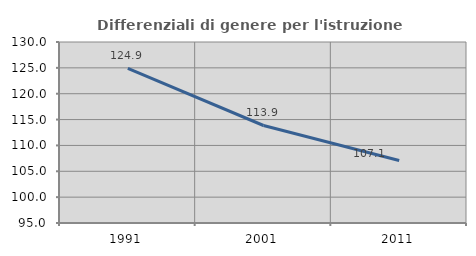
| Category | Differenziali di genere per l'istruzione superiore |
|---|---|
| 1991.0 | 124.899 |
| 2001.0 | 113.854 |
| 2011.0 | 107.078 |